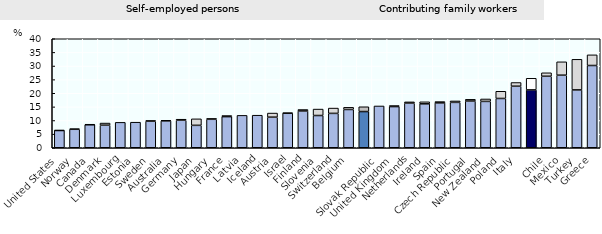
| Category | Self-employed | Contributing family workers |
|---|---|---|
| United States | 6.342 | 0.058 |
| Norway | 6.78 | 0.175 |
| Canada | 8.449 | 0.131 |
| Denmark | 8.287 | 0.776 |
| Luxembourg | 9.322 | 0 |
| Estonia | 9.375 | 0 |
| Sweden | 9.734 | 0.255 |
| Australia | 9.867 | 0.219 |
| Germany | 10.089 | 0.383 |
| Japan | 8.223 | 2.387 |
| Hungary | 10.445 | 0.301 |
| France | 11.417 | 0.4 |
| Latvia | 11.886 | 0 |
| Iceland | 11.947 | 0 |
| Austria | 11.223 | 1.51 |
| Israel | 12.682 | 0.092 |
| Finland | 13.507 | 0.525 |
| Slovenia | 11.83 | 2.367 |
| Switzerland | 12.614 | 1.948 |
| Belgium | 14.045 | 0.798 |
|  | 13.281 | 1.76 |
| Slovak Republic | 15.338 | 0 |
| United Kingdom | 15.111 | 0.372 |
| Netherlands | 16.389 | 0.446 |
| Ireland | 16.124 | 0.735 |
| Spain | 16.47 | 0.479 |
| Czech Republic | 16.653 | 0.527 |
| Portugal | 17.15 | 0.629 |
| New Zealand | 17.012 | 0.893 |
| Poland | 18.09 | 2.644 |
| Italy | 22.581 | 1.362 |
|  | 21.231 | 4.265 |
| Chile | 26.238 | 1.273 |
| Mexico | 26.634 | 4.903 |
| Turkey | 21.228 | 11.231 |
| Greece | 30.185 | 3.912 |